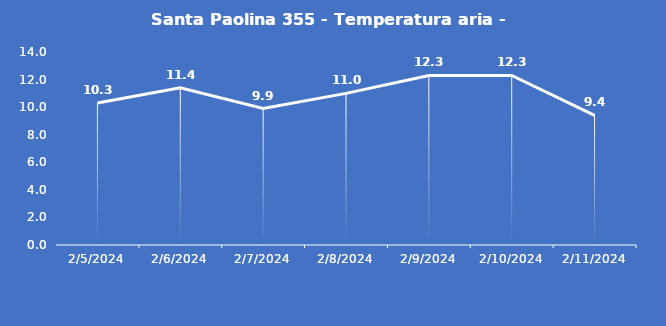
| Category | Santa Paolina 355 - Temperatura aria - Grezzo (°C) |
|---|---|
| 2/5/24 | 10.3 |
| 2/6/24 | 11.4 |
| 2/7/24 | 9.9 |
| 2/8/24 | 11 |
| 2/9/24 | 12.3 |
| 2/10/24 | 12.3 |
| 2/11/24 | 9.4 |